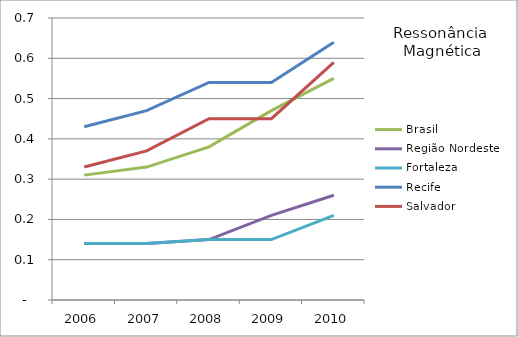
| Category | Brasil | Região Nordeste | Fortaleza | Recife | Salvador |
|---|---|---|---|---|---|
| 2006.0 | 0.31 | 0.14 | 0.14 | 0.43 | 0.33 |
| 2007.0 | 0.33 | 0.14 | 0.14 | 0.47 | 0.37 |
| 2008.0 | 0.38 | 0.15 | 0.15 | 0.54 | 0.45 |
| 2009.0 | 0.47 | 0.21 | 0.15 | 0.54 | 0.45 |
| 2010.0 | 0.55 | 0.26 | 0.21 | 0.64 | 0.59 |